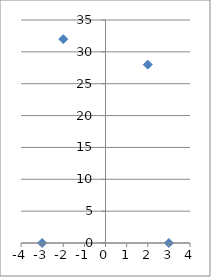
| Category | Series 0 |
|---|---|
| -3.0 | 0 |
| 3.0 | 0 |
| -2.0 | 32 |
| 2.0 | 28 |